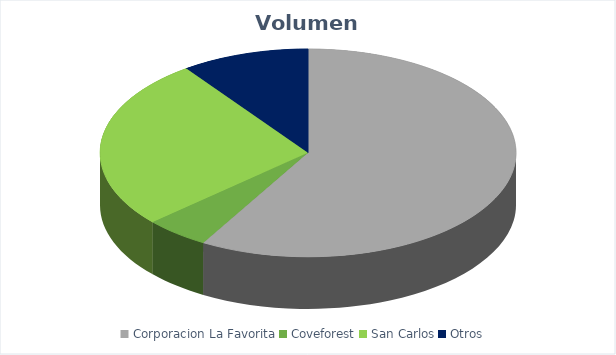
| Category | VOLUMEN ($USD) |
|---|---|
| Corporacion La Favorita | 58157.95 |
| Coveforest | 4999.8 |
| San Carlos | 26550 |
| Otros | 9900 |